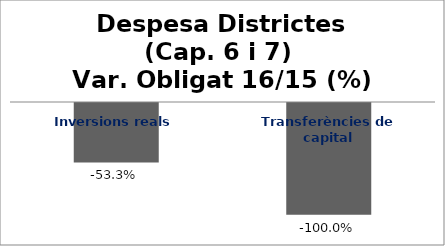
| Category | Series 0 |
|---|---|
| Inversions reals | -0.533 |
| Transferències de capital | -1 |